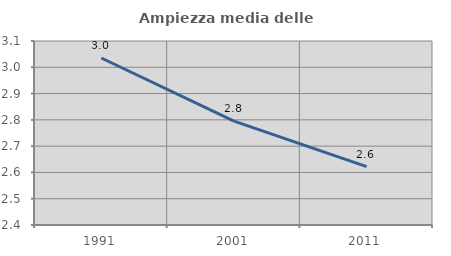
| Category | Ampiezza media delle famiglie |
|---|---|
| 1991.0 | 3.035 |
| 2001.0 | 2.795 |
| 2011.0 | 2.622 |